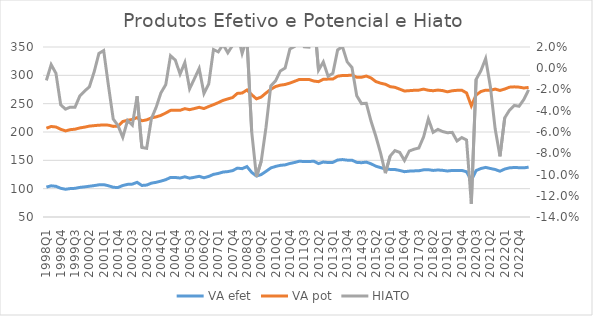
| Category | VA efet | VA pot |
|---|---|---|
| 1998Q1 | 102.762 | 103.953 |
| 1998Q2 | 105.026 | 104.667 |
| 1998Q3 | 104.171 | 104.667 |
| 1998Q4 | 100.637 | 104.225 |
| 1999Q1 | 98.978 | 102.939 |
| 1999Q2 | 100.157 | 103.961 |
| 1999Q3 | 100.576 | 104.402 |
| 1999Q4 | 102.216 | 104.955 |
| 2000Q1 | 103.155 | 105.419 |
| 2000Q2 | 104.262 | 106.12 |
| 2000Q3 | 105.427 | 105.796 |
| 2000Q4 | 106.739 | 105.272 |
| 2001Q1 | 107.079 | 105.327 |
| 2001Q2 | 105.162 | 106.927 |
| 2001Q3 | 102.388 | 107.528 |
| 2001Q4 | 102.093 | 107.916 |
| 2002Q1 | 105.586 | 112.929 |
| 2002Q2 | 107.566 | 113.136 |
| 2002Q3 | 108.023 | 114.128 |
| 2002Q4 | 111.189 | 114.199 |
| 2003Q1 | 105.642 | 114.156 |
| 2003Q2 | 106.359 | 115.028 |
| 2003Q3 | 109.745 | 115.198 |
| 2003Q4 | 111.235 | 115.463 |
| 2004Q1 | 113.329 | 116.007 |
| 2004Q2 | 115.856 | 117.673 |
| 2004Q3 | 119.773 | 118.376 |
| 2004Q4 | 119.754 | 118.842 |
| 2005Q1 | 118.797 | 119.451 |
| 2005Q2 | 120.929 | 120.283 |
| 2005Q3 | 118.538 | 120.879 |
| 2005Q4 | 120.09 | 121.284 |
| 2006Q1 | 121.791 | 121.814 |
| 2006Q2 | 119.231 | 122.127 |
| 2006Q3 | 121.576 | 123.404 |
| 2006Q4 | 125.213 | 123.041 |
| 2007Q1 | 126.865 | 124.94 |
| 2007Q2 | 129.319 | 126.486 |
| 2007Q3 | 130.122 | 128.253 |
| 2007Q4 | 131.822 | 129.034 |
| 2008Q1 | 136.227 | 131.913 |
| 2008Q2 | 135.316 | 133.454 |
| 2008Q3 | 138.967 | 135.144 |
| 2008Q4 | 128.774 | 136.944 |
| 2009Q1 | 122.283 | 136.199 |
| 2009Q2 | 124.859 | 136.826 |
| 2009Q3 | 130.58 | 138.259 |
| 2009Q4 | 136.506 | 138.807 |
| 2010Q1 | 139.276 | 140.942 |
| 2010Q2 | 141.149 | 141.511 |
| 2010Q3 | 141.955 | 141.925 |
| 2010Q4 | 144.44 | 141.875 |
| 2011Q1 | 146.242 | 143.282 |
| 2011Q2 | 148.509 | 144.276 |
| 2011Q3 | 147.783 | 144.868 |
| 2011Q4 | 147.798 | 144.916 |
| 2012Q1 | 148.551 | 141.381 |
| 2012Q2 | 144.288 | 144.549 |
| 2012Q3 | 146.964 | 146.096 |
| 2012Q4 | 146.116 | 147.226 |
| 2013Q1 | 146.389 | 147.078 |
| 2013Q2 | 150.515 | 147.965 |
| 2013Q3 | 151.353 | 148.321 |
| 2013Q4 | 150.321 | 149.425 |
| 2014Q1 | 150.296 | 150.184 |
| 2014Q2 | 146.409 | 150.289 |
| 2014Q3 | 145.806 | 150.821 |
| 2014Q4 | 146.884 | 151.884 |
| 2015Q1 | 143.892 | 151.453 |
| 2015Q2 | 139.709 | 149.265 |
| 2015Q3 | 137.105 | 149.005 |
| 2015Q4 | 134.726 | 149.489 |
| 2016Q1 | 133.968 | 146.035 |
| 2016Q2 | 133.805 | 145.045 |
| 2016Q3 | 132.136 | 143.497 |
| 2016Q4 | 129.983 | 142.341 |
| 2017Q1 | 130.943 | 142.007 |
| 2017Q2 | 131.366 | 142.205 |
| 2017Q3 | 131.59 | 142.27 |
| 2017Q4 | 133.229 | 142.443 |
| 2018Q1 | 133.468 | 140.154 |
| 2018Q2 | 132.182 | 140.665 |
| 2018Q3 | 132.928 | 141.048 |
| 2018Q4 | 132.333 | 140.717 |
| 2019Q1 | 131.199 | 139.676 |
| 2019Q2 | 132.146 | 140.635 |
| 2019Q3 | 131.921 | 141.611 |
| 2019Q4 | 132.242 | 141.474 |
| 2020Q1 | 129.789 | 139.191 |
| 2020Q2 | 114.701 | 131.461 |
| 2020Q3 | 131.932 | 133.331 |
| 2020Q4 | 135.534 | 135.865 |
| 2021Q1 | 137.543 | 136.299 |
| 2021Q2 | 135.607 | 138.027 |
| 2021Q3 | 133.798 | 141.92 |
| 2021Q4 | 130.754 | 142.574 |
| 2022Q1 | 134.621 | 141.207 |
| 2022Q2 | 136.756 | 142.372 |
| 2022Q3 | 137.353 | 142.332 |
| 2022Q4 | 137.035 | 142.119 |
| 2023Q1 | 136.755 | 140.897 |
| 2023Q2 | 137.938 | 140.79 |